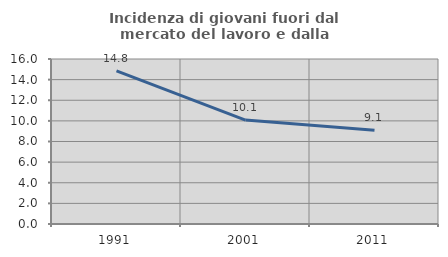
| Category | Incidenza di giovani fuori dal mercato del lavoro e dalla formazione  |
|---|---|
| 1991.0 | 14.844 |
| 2001.0 | 10.078 |
| 2011.0 | 9.091 |